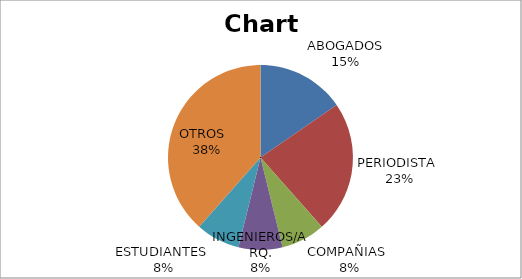
| Category | Series 0 |
|---|---|
| ABOGADOS | 2 |
| PERIODISTA  | 3 |
| COMPAÑIAS  | 1 |
| INGENIEROS/ARQ. | 1 |
| ESTUDIANTES  | 1 |
| OTROS   | 5 |